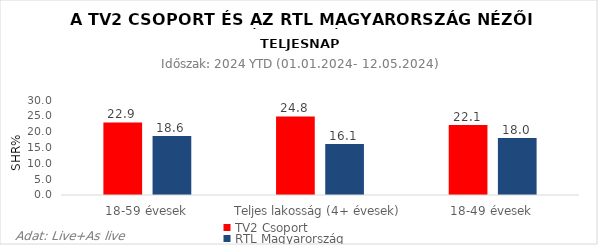
| Category | TV2 Csoport | RTL Magyarország |
|---|---|---|
| 18-59 évesek | 22.9 | 18.6 |
| Teljes lakosság (4+ évesek) | 24.8 | 16.1 |
| 18-49 évesek | 22.1 | 18 |